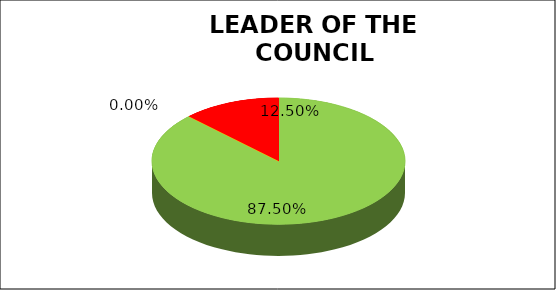
| Category | Q3 |
|---|---|
| Green | 0.875 |
| Amber | 0 |
| Red | 0.125 |